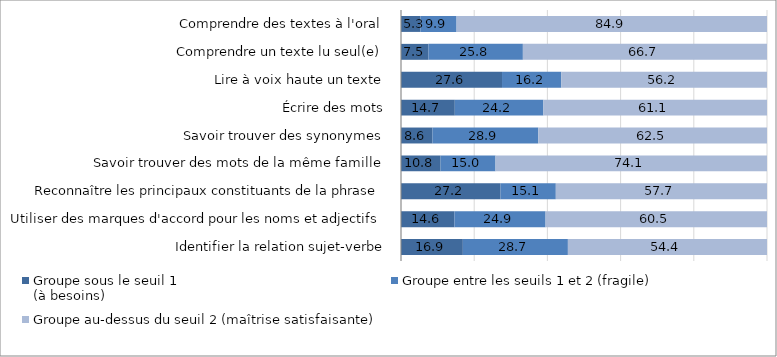
| Category | Groupe sous le seuil 1 
(à besoins) | Groupe entre les seuils 1 et 2 (fragile) | Groupe au-dessus du seuil 2 (maîtrise satisfaisante) |
|---|---|---|---|
| Identifier la relation sujet-verbe | 16.9 | 28.7 | 54.4 |
| Utiliser des marques d'accord pour les noms et adjectifs | 14.6 | 24.9 | 60.5 |
| Reconnaître les principaux constituants de la phrase | 27.2 | 15.1 | 57.7 |
| Savoir trouver des mots de la même famille | 10.8 | 15 | 74.1 |
| Savoir trouver des synonymes | 8.6 | 28.9 | 62.5 |
| Écrire des mots | 14.7 | 24.2 | 61.1 |
| Lire à voix haute un texte | 27.6 | 16.2 | 56.2 |
| Comprendre un texte lu seul(e) | 7.5 | 25.8 | 66.7 |
| Comprendre des textes à l'oral | 5.3 | 9.9 | 84.9 |